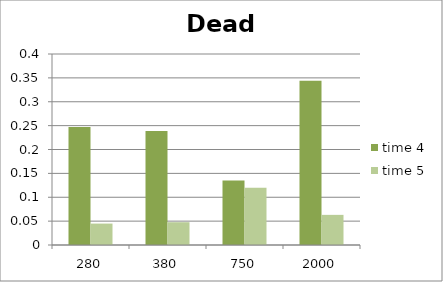
| Category | time 4 | time 5 |
|---|---|---|
| 280.0 | 0.247 | 0.045 |
| 380.0 | 0.239 | 0.048 |
| 750.0 | 0.135 | 0.12 |
| 2000.0 | 0.344 | 0.063 |